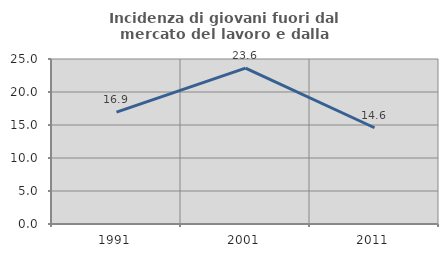
| Category | Incidenza di giovani fuori dal mercato del lavoro e dalla formazione  |
|---|---|
| 1991.0 | 16.941 |
| 2001.0 | 23.618 |
| 2011.0 | 14.583 |